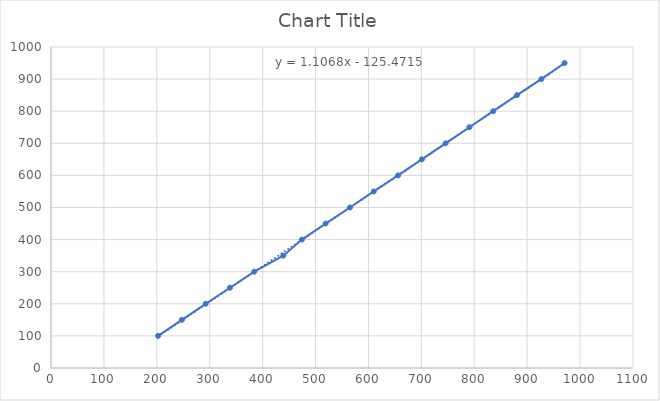
| Category | Series 0 |
|---|---|
| 202.35 | 100 |
| 247.31 | 150 |
| 292.28 | 200 |
| 338.22 | 250 |
| 384.17 | 300 |
| 439.13 | 350 |
| 474.1 | 400 |
| 519.06 | 450 |
| 565.01 | 500 |
| 609.97 | 550 |
| 655.92 | 600 |
| 700.88 | 650 |
| 745.85 | 700 |
| 790.81 | 750 |
| 835.78 | 800 |
| 880.75 | 850 |
| 926.69 | 900 |
| 970.65 | 950 |